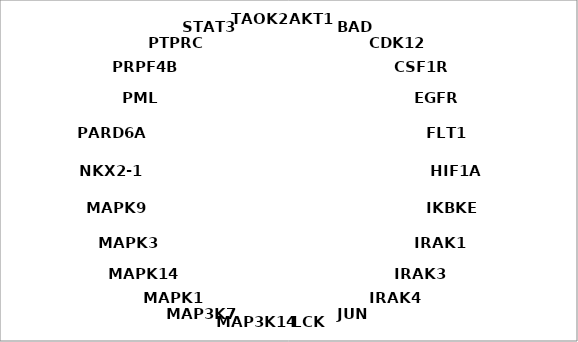
| Category | Series 0 |
|---|---|
| AKT1 | 1 |
| BAD | 1 |
| CDK12 | 1 |
| CSF1R | 1 |
| EGFR | 1 |
| FLT1 | 1 |
| HIF1A | 1 |
| IKBKE | 1 |
| IRAK1 | 1 |
| IRAK3 | 1 |
| IRAK4 | 1 |
| JUN | 1 |
| LCK | 1 |
| MAP3K14 | 1 |
| MAP3K7 | 1 |
| MAPK1 | 1 |
| MAPK14 | 1 |
| MAPK3 | 1 |
| MAPK9 | 1 |
| NKX2-1 | 1 |
| PARD6A | 1 |
| PML | 1 |
| PRPF4B | 1 |
| PTPRC | 1 |
| STAT3 | 1 |
| TAOK2 | 1 |